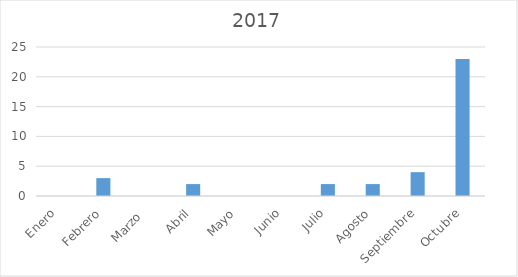
| Category | Series 0 |
|---|---|
| Enero | 0 |
| Febrero | 3 |
| Marzo  | 0 |
| Abril | 2 |
| Mayo | 0 |
| Junio | 0 |
| Julio | 2 |
| Agosto | 2 |
| Septiembre | 4 |
| Octubre | 23 |